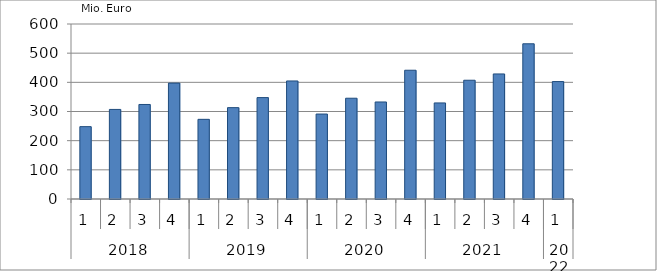
| Category | Ausbaugewerblicher Umsatz3 |
|---|---|
| 0 | 248133.418 |
| 1 | 307099.899 |
| 2 | 324088.989 |
| 3 | 397377.201 |
| 4 | 273159.137 |
| 5 | 313254.251 |
| 6 | 347631.281 |
| 7 | 404721.054 |
| 8 | 291272.144 |
| 9 | 345494.215 |
| 10 | 332629.265 |
| 11 | 441463.36 |
| 12 | 329380.212 |
| 13 | 407164.972 |
| 14 | 428783.222 |
| 15 | 532137.089 |
| 16 | 402625.565 |